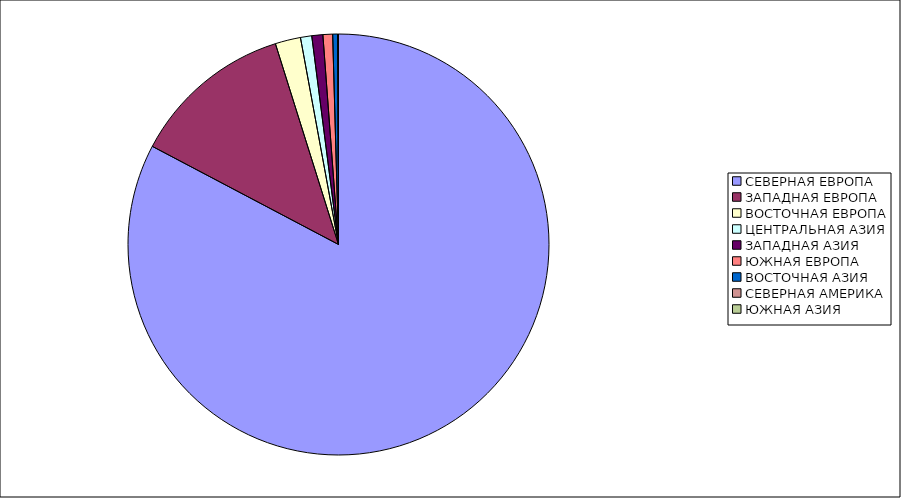
| Category | Оборот |
|---|---|
| СЕВЕРНАЯ ЕВРОПА | 82.721 |
| ЗАПАДНАЯ ЕВРОПА | 12.433 |
| ВОСТОЧНАЯ ЕВРОПА | 1.951 |
| ЦЕНТРАЛЬНАЯ АЗИЯ | 0.865 |
| ЗАПАДНАЯ АЗИЯ | 0.847 |
| ЮЖНАЯ ЕВРОПА | 0.741 |
| ВОСТОЧНАЯ АЗИЯ | 0.372 |
| СЕВЕРНАЯ АМЕРИКА | 0.069 |
| ЮЖНАЯ АЗИЯ | 0.001 |